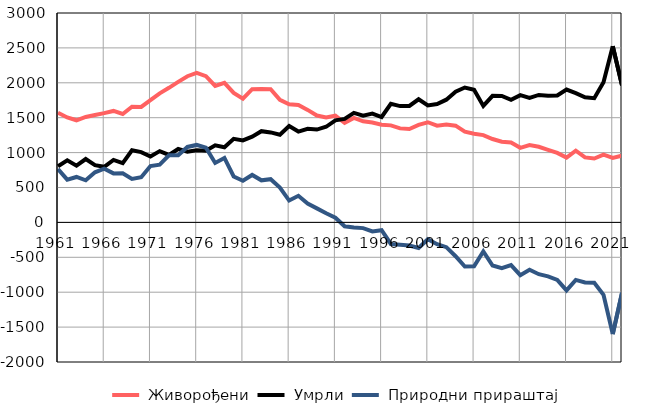
| Category |  Живорођени |  Умрли |  Природни прираштај |
|---|---|---|---|
| 1961.0 | 1570 | 805 | 765 |
| 1962.0 | 1503 | 890 | 613 |
| 1963.0 | 1463 | 812 | 651 |
| 1964.0 | 1511 | 908 | 603 |
| 1965.0 | 1539 | 821 | 718 |
| 1966.0 | 1566 | 797 | 769 |
| 1967.0 | 1597 | 895 | 702 |
| 1968.0 | 1553 | 848 | 705 |
| 1969.0 | 1657 | 1034 | 623 |
| 1970.0 | 1654 | 1007 | 647 |
| 1971.0 | 1752 | 945 | 807 |
| 1972.0 | 1849 | 1021 | 828 |
| 1973.0 | 1928 | 967 | 961 |
| 1974.0 | 2013 | 1052 | 961 |
| 1975.0 | 2094 | 1013 | 1081 |
| 1976.0 | 2143 | 1033 | 1110 |
| 1977.0 | 2096 | 1026 | 1070 |
| 1978.0 | 1956 | 1104 | 852 |
| 1979.0 | 1999 | 1076 | 923 |
| 1980.0 | 1856 | 1198 | 658 |
| 1981.0 | 1772 | 1175 | 597 |
| 1982.0 | 1909 | 1229 | 680 |
| 1983.0 | 1910 | 1307 | 603 |
| 1984.0 | 1908 | 1289 | 619 |
| 1985.0 | 1756 | 1256 | 500 |
| 1986.0 | 1693 | 1380 | 313 |
| 1987.0 | 1682 | 1301 | 381 |
| 1988.0 | 1612 | 1341 | 271 |
| 1989.0 | 1531 | 1330 | 201 |
| 1990.0 | 1502 | 1370 | 132 |
| 1991.0 | 1529 | 1462 | 67 |
| 1992.0 | 1426 | 1482 | -56 |
| 1993.0 | 1496 | 1570 | -74 |
| 1994.0 | 1448 | 1530 | -82 |
| 1995.0 | 1430 | 1560 | -130 |
| 1996.0 | 1399 | 1510 | -111 |
| 1997.0 | 1390 | 1699 | -309 |
| 1998.0 | 1347 | 1666 | -319 |
| 1999.0 | 1338 | 1669 | -331 |
| 2000.0 | 1397 | 1764 | -367 |
| 2001.0 | 1435 | 1676 | -241 |
| 2002.0 | 1385 | 1697 | -312 |
| 2003.0 | 1403 | 1758 | -355 |
| 2004.0 | 1386 | 1871 | -485 |
| 2005.0 | 1299 | 1932 | -633 |
| 2006.0 | 1270 | 1899 | -629 |
| 2007.0 | 1251 | 1668 | -417 |
| 2008.0 | 1195 | 1813 | -618 |
| 2009.0 | 1156 | 1812 | -656 |
| 2010.0 | 1145 | 1756 | -611 |
| 2011.0 | 1068 | 1823 | -755 |
| 2012.0 | 1107 | 1784 | -677 |
| 2013.0 | 1084 | 1826 | -742 |
| 2014.0 | 1040 | 1813 | -773 |
| 2015.0 | 995 | 1818 | -823 |
| 2016.0 | 929 | 1903 | -974 |
| 2017.0 | 1028 | 1852 | -824 |
| 2018.0 | 931 | 1792 | -861 |
| 2019.0 | 915 | 1780 | -865 |
| 2020.0 | 970 | 2007 | -1037 |
| 2021.0 | 925 | 2525 | -1600 |
| 2022.0 | 956 | 1965 | -1009 |